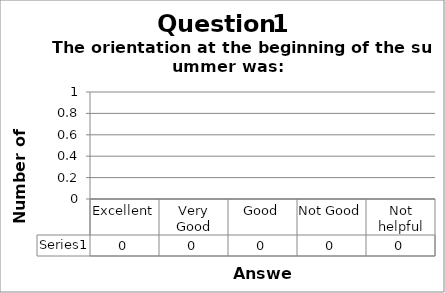
| Category | Series 0 |
|---|---|
| Excellent | 0 |
| Very Good | 0 |
| Good | 0 |
| Not Good | 0 |
| Not helpful | 0 |